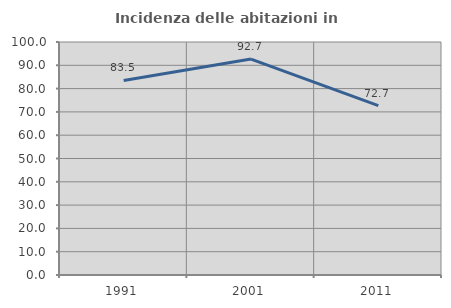
| Category | Incidenza delle abitazioni in proprietà  |
|---|---|
| 1991.0 | 83.505 |
| 2001.0 | 92.683 |
| 2011.0 | 72.727 |